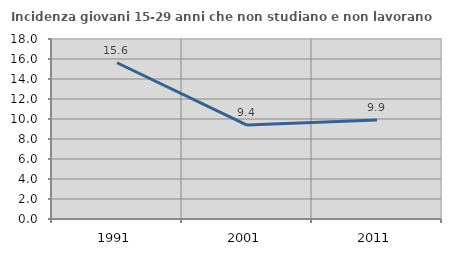
| Category | Incidenza giovani 15-29 anni che non studiano e non lavorano  |
|---|---|
| 1991.0 | 15.625 |
| 2001.0 | 9.396 |
| 2011.0 | 9.91 |